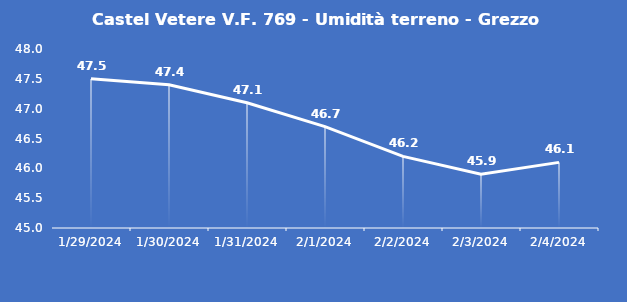
| Category | Castel Vetere V.F. 769 - Umidità terreno - Grezzo (%VWC) |
|---|---|
| 1/29/24 | 47.5 |
| 1/30/24 | 47.4 |
| 1/31/24 | 47.1 |
| 2/1/24 | 46.7 |
| 2/2/24 | 46.2 |
| 2/3/24 | 45.9 |
| 2/4/24 | 46.1 |